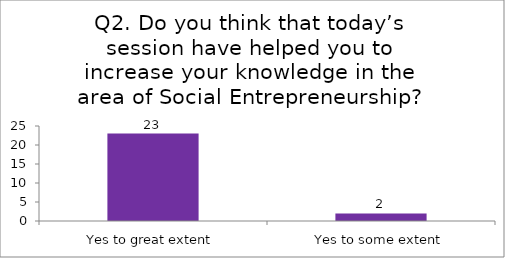
| Category | Q2. Do you think that today’s session have helped you to increase your knowledge in the area of Social Entrepreneurship? |
|---|---|
| Yes to great extent | 23 |
| Yes to some extent | 2 |